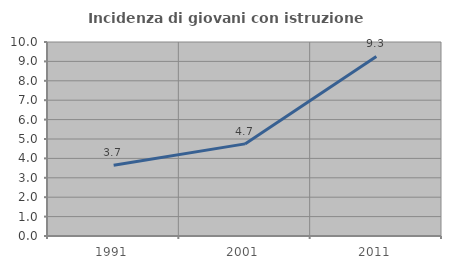
| Category | Incidenza di giovani con istruzione universitaria |
|---|---|
| 1991.0 | 3.652 |
| 2001.0 | 4.749 |
| 2011.0 | 9.253 |